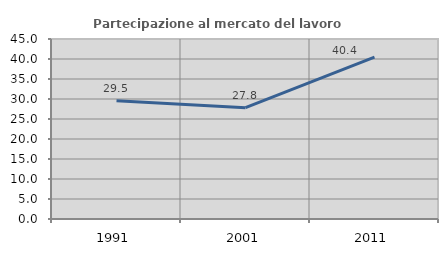
| Category | Partecipazione al mercato del lavoro  femminile |
|---|---|
| 1991.0 | 29.545 |
| 2001.0 | 27.827 |
| 2011.0 | 40.449 |